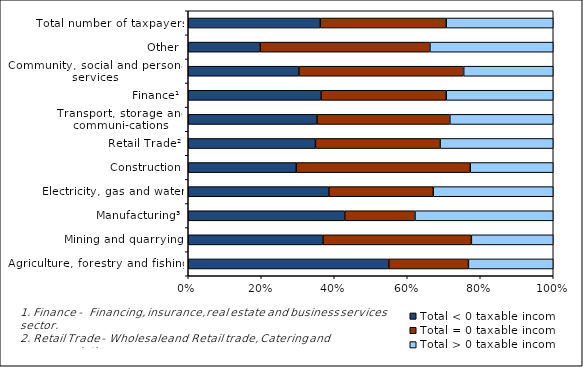
| Category | Total < 0 taxable income | Total = 0 taxable income | Total > 0 taxable income |
|---|---|---|---|
| Agriculture, forestry and fishing | 10648 | 4226 | 4503 |
| Mining and quarrying | 829 | 913 | 504 |
| Manufacturing³ | 22181 | 9965 | 19601 |
| Electricity, gas and water | 824 | 612 | 703 |
| Construction | 15574 | 25064 | 11972 |
| Retail Trade² | 43185 | 42318 | 38404 |
| Transport, storage and communi-cations | 7745 | 7999 | 6223 |
| Finance¹ | 90390 | 85306 | 72853 |
| Community, social and personal services | 10442 | 15550 | 8454 |
| Other | 575 | 1359 | 987 |
| Total number of taxpayers | 202393 | 193312 | 164204 |